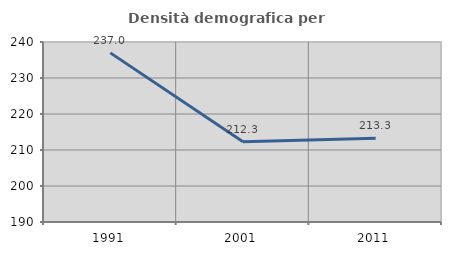
| Category | Densità demografica |
|---|---|
| 1991.0 | 236.979 |
| 2001.0 | 212.295 |
| 2011.0 | 213.253 |